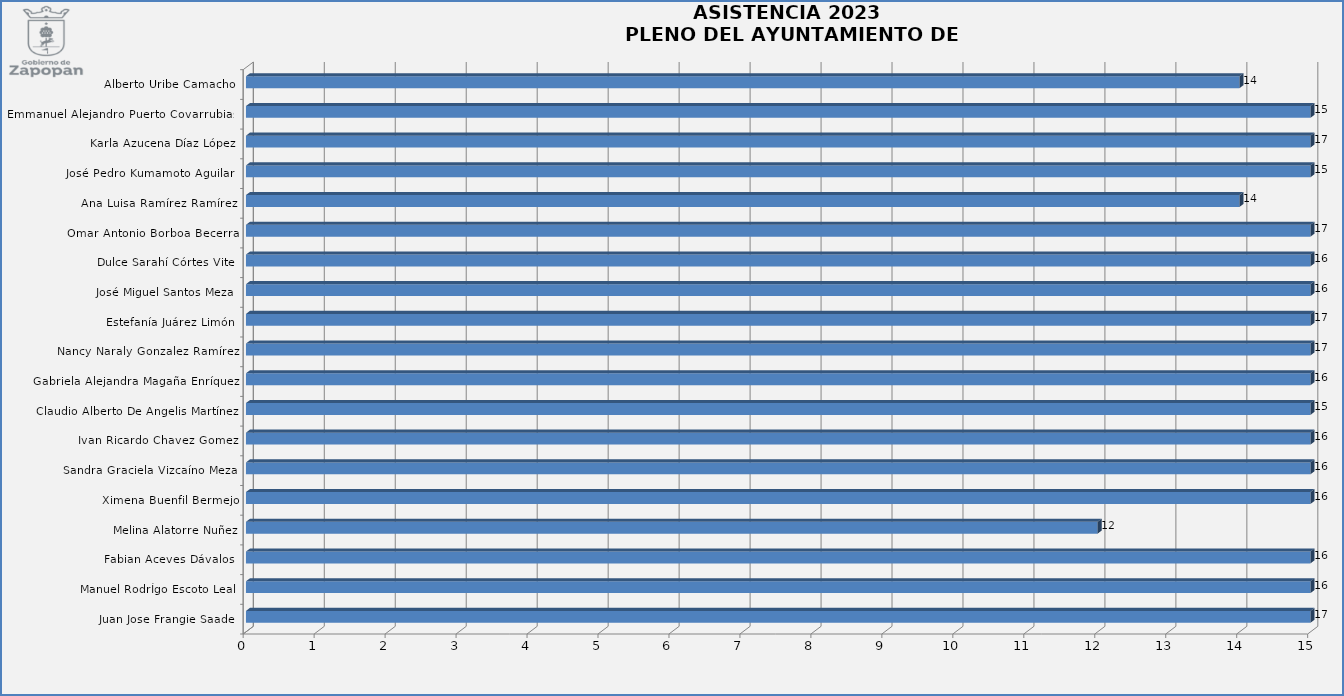
| Category | Series 0 |
|---|---|
| Juan Jose Frangie Saade  | 17 |
| Manuel RodrÍgo Escoto Leal  | 16 |
| Fabian Aceves Dávalos  | 16 |
| Melina Alatorre Nuñez | 12 |
| Ximena Buenfil Bermejo | 16 |
| Sandra Graciela Vizcaíno Meza  | 16 |
| Ivan Ricardo Chavez Gomez  | 16 |
| Claudio Alberto De Angelis Martínez  | 15 |
| Gabriela Alejandra Magaña Enríquez  | 16 |
| Nancy Naraly Gonzalez Ramírez  | 17 |
| Estefanía Juárez Limón  | 17 |
| José Miguel Santos Meza  | 16 |
| Dulce Sarahí Córtes Vite  | 16 |
| Omar Antonio Borboa Becerra  | 17 |
| Ana Luisa Ramírez Ramírez  | 14 |
| José Pedro Kumamoto Aguilar   | 15 |
| Karla Azucena Díaz López  | 17 |
| Emmanuel Alejandro Puerto Covarrubias   | 15 |
| Alberto Uribe Camacho  | 14 |